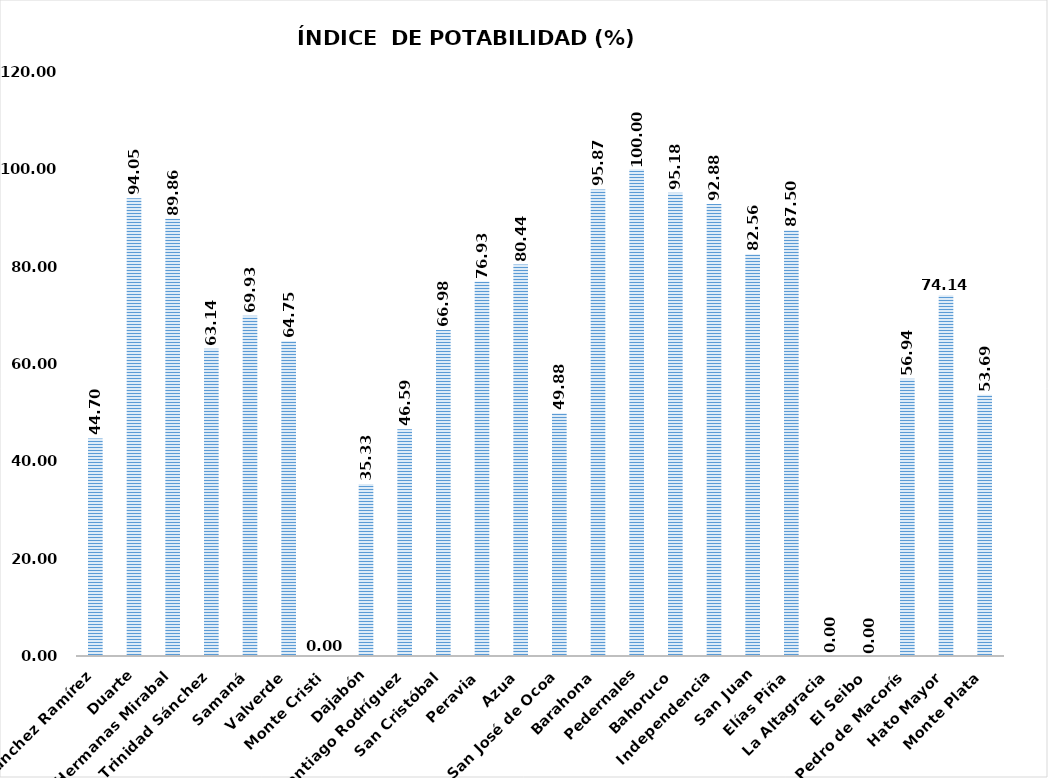
| Category | 44.70  |
|---|---|
| Sánchez Ramírez | 44.697 |
| Duarte | 94.053 |
| Hermanas Mirabal | 89.864 |
| María Trinidad Sánchez | 63.14 |
| Samaná | 69.934 |
| Valverde | 64.748 |
| Monte Cristi | 0 |
| Dajabón | 35.328 |
| Santiago Rodríguez | 46.592 |
| San Cristóbal | 66.977 |
| Peravia | 76.927 |
| Azua | 80.439 |
| San José de Ocoa | 49.877 |
| Barahona | 95.867 |
| Pedernales | 100 |
| Bahoruco | 95.179 |
| Independencia | 92.884 |
| San Juan | 82.56 |
| Elías Piña | 87.5 |
| La Altagracia | 0 |
| El Seibo | 0 |
| San Pedro de Macorís | 56.944 |
| Hato Mayor | 74.14 |
| Monte Plata | 53.69 |